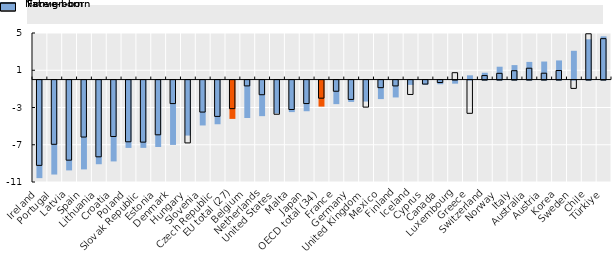
| Category | Foreign-born | Native-born |
|---|---|---|
| Ireland | -10.478 | -9.16 |
| Portugal | -10.091 | -6.896 |
| Latvia | -9.647 | -8.6 |
| Spain | -9.54 | -6.118 |
| Lithuania | -8.984 | -8.242 |
| Croatia | -8.682 | -6.06 |
| Poland | -7.231 | -6.629 |
| Slovak Republic | -7.226 | -6.663 |
| Estonia | -7.132 | -5.878 |
| Denmark | -6.91 | -2.527 |
| Hungary | -5.907 | -6.749 |
| Slovenia | -4.822 | -3.437 |
| Czech Republic | -4.692 | -3.901 |
| EU total (27) | -4.116 | -3.071 |
| Belgium | -4.023 | -0.627 |
| Netherlands | -3.822 | -1.575 |
| United States | -3.52 | -3.67 |
| Malta | -3.387 | -3.16 |
| Japan | -3.294 | -2.523 |
| OECD total (34) | -2.798 | -1.945 |
| France | -2.531 | -1.201 |
| Germany | -2.292 | -2.08 |
| United Kingdom | -2.253 | -2.906 |
| Mexico | -1.991 | -0.816 |
| Finland | -1.814 | -0.629 |
| Iceland | -0.465 | -1.546 |
| Cyprus | -0.444 | -0.43 |
| Canada | -0.396 | -0.261 |
| Luxembourg | -0.335 | 0.739 |
| Greece | 0.455 | -3.572 |
| Switzerland | 0.732 | 0.429 |
| Norway | 1.38 | 0.671 |
| Italy | 1.553 | 0.95 |
| Australia | 1.896 | 1.218 |
| Austria | 1.936 | 0.682 |
| Korea | 2.054 | 0.971 |
| Sweden | 3.089 | -0.895 |
| Chile | 4.325 | 4.917 |
| Türkiye | 4.643 | 4.393 |